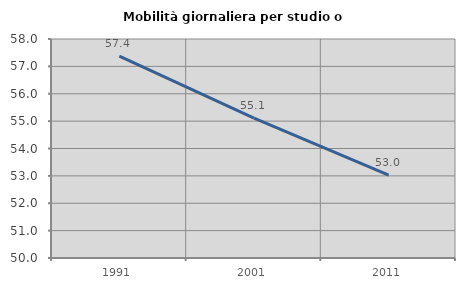
| Category | Mobilità giornaliera per studio o lavoro |
|---|---|
| 1991.0 | 57.373 |
| 2001.0 | 55.106 |
| 2011.0 | 53.03 |